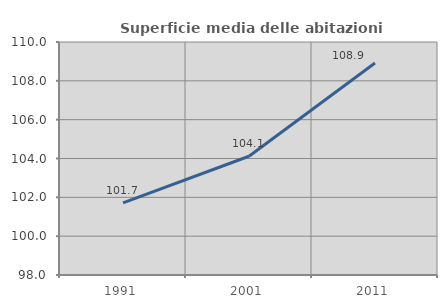
| Category | Superficie media delle abitazioni occupate |
|---|---|
| 1991.0 | 101.716 |
| 2001.0 | 104.117 |
| 2011.0 | 108.917 |